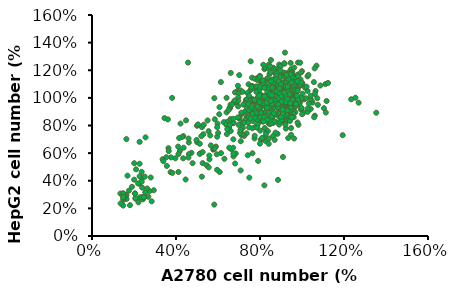
| Category | HepG2 |
|---|---|
| 0.9260116677470136 | 0.904 |
| 0.6408000740809334 | 0.895 |
| 0.8423002129826835 | 0.982 |
| 0.8823039170293546 | 0.94 |
| 0.4341142698398 | 0.563 |
| 0.8156310769515696 | 0.958 |
| 0.8897120103713306 | 0.863 |
| 0.9097138623946661 | 0.835 |
| 0.3452171497360867 | 0.854 |
| 0.9200851930734327 | 0.812 |
| 0.9023057690526901 | 0.991 |
| 0.9097138623946661 | 0.996 |
| 0.8778590610241689 | 0.963 |
| 0.8378553569774979 | 1.005 |
| 0.9037873877210852 | 1.014 |
| 0.9630521344568942 | 0.93 |
| 0.7830354662468747 | 0.921 |
| 0.8326696916381147 | 0.918 |
| 0.8904528197055283 | 0.946 |
| 0.9141587183998519 | 0.923 |
| 0.858598018335031 | 0.955 |
| 0.9334197610889897 | 0.935 |
| 0.9111954810630614 | 0.854 |
| 1.1045467172886378 | 0.925 |
| 0.7645152328919345 | 0.971 |
| 0.8911936290397259 | 1 |
| 0.8904528197055283 | 1.018 |
| 0.9763867024724512 | 1.062 |
| 0.8534123529956478 | 0.979 |
| 0.8897120103713306 | 0.98 |
| 0.9356421890915826 | 0.952 |
| 1.075655153254931 | 0.949 |
| 0.694879155477359 | 1.088 |
| 0.8230391702935457 | 0.953 |
| 0.8734142050189833 | 0.979 |
| 0.8060005556070007 | 0.93 |
| 0.7363644781924252 | 0.743 |
| 0.9682377997962774 | 0.949 |
| 0.8608204463376239 | 0.9 |
| 1.113436429299009 | 0.894 |
| 0.6874710621353829 | 0.966 |
| 0.7341420501898324 | 0.984 |
| 0.8111862209463839 | 0.954 |
| 0.3970738031299194 | 0.563 |
| 0.8430410223168812 | 0.964 |
| 0.9734234651356607 | 0.968 |
| 0.862302065006019 | 0.972 |
| 0.9430502824335587 | 1.044 |
| 0.7978516529308269 | 0.953 |
| 0.6763589221224188 | 0.971 |
| 0.7534030928789702 | 1.055 |
| 0.8274840262987314 | 0.965 |
| 0.8208167422909529 | 0.988 |
| 0.7971108435966293 | 0.934 |
| 0.8637836836744143 | 1.001 |
| 1.0504676358922123 | 0.966 |
| 0.6408000740809334 | 1.001 |
| 0.597833132697472 | 0.814 |
| 0.7400685248634132 | 1.035 |
| 0.7430317622002037 | 0.981 |
| 0.8252615982961385 | 0.961 |
| 0.7741457542365033 | 0.915 |
| 0.8363737383091027 | 0.983 |
| 0.925270858412816 | 0.994 |
| 1.0726919159181405 | 0.997 |
| 0.7897027502546532 | 1.006 |
| 0.7593295675525512 | 0.923 |
| 0.8630428743402166 | 0.892 |
| 0.8482266876562645 | 0.967 |
| 0.8882303917029355 | 0.991 |
| 0.9297157144180017 | 0.839 |
| 1.045281970552829 | 0.98 |
| 0.8534123529956478 | 0.996 |
| 0.8022965089360126 | 1.092 |
| 0.5504213353088249 | 0.837 |
| 0.22668765626446893 | 0.682 |
| 0.771182516899713 | 0.977 |
| 0.831928882303917 | 0.981 |
| 0.8022965089360126 | 1.006 |
| 0.965274562459487 | 1.01 |
| 0.8210005706676812 | 1.208 |
| 0.8735019973368842 | 1.176 |
| 0.8818717899942933 | 1.117 |
| 0.9214380825565912 | 1.049 |
| 0.9267643142476698 | 0.926 |
| 1.0112231310633442 | 0.99 |
| 0.9602434848773065 | 1.003 |
| 0.7601293513410691 | 1.066 |
| 0.9686132775347156 | 1.129 |
| 0.7920867414875404 | 1.044 |
| 0.6574091687274111 | 0.926 |
| 0.9298078752140004 | 1.033 |
| 0.9762221799505422 | 0.952 |
| 0.9678523872931329 | 1.036 |
| 0.948069241011984 | 1.081 |
| 0.9396994483545749 | 1.06 |
| 0.9085029484496862 | 1.08 |
| 0.8400228267072475 | 0.991 |
| 0.8156743389766026 | 1.014 |
| 0.7631729123073997 | 0.992 |
| 0.8210005706676812 | 0.367 |
| 0.5820810348107286 | 0.227 |
| 0.8438272779151608 | 0.978 |
| 0.9085029484496862 | 0.988 |
| 0.9336123264219136 | 1.091 |
| 0.8780673387863801 | 1.004 |
| 0.8674148754042229 | 0.986 |
| 0.9054593874833555 | 0.923 |
| 0.983070192124786 | 0.805 |
| 1.0074186798554308 | 0.894 |
| 0.9442647898040708 | 0.892 |
| 1.2341639718470612 | 0.99 |
| 0.8308921438082557 | 1.022 |
| 0.8620886437131444 | 1.023 |
| 0.9686132775347156 | 1.038 |
| 0.8194787901845159 | 0.874 |
| 0.8118698877686894 | 0.893 |
| 0.8286094730835077 | 0.902 |
| 0.8293703633250904 | 0.956 |
| 0.8293703633250904 | 0.986 |
| 0.9107856191744341 | 0.971 |
| 0.9678523872931329 | 1.008 |
| 0.932851436180331 | 1.01 |
| 0.8696975461289709 | 1.026 |
| 0.9267643142476698 | 0.967 |
| 0.8894806924101198 | 0.884 |
| 0.8575233022636485 | 0.878 |
| 0.8818717899942933 | 0.933 |
| 1.0272018261365798 | 0.899 |
| 0.9244816435229218 | 0.873 |
| 0.8483926193646566 | 1 |
| 0.2548982309301883 | 0.714 |
| 0.8833935704774586 | 0.739 |
| 0.948069241011984 | 0.782 |
| 0.8856762412022066 | 0.406 |
| 0.9396994483545749 | 1.003 |
| 0.8704584363705535 | 0.937 |
| 0.8103481072855241 | 0.957 |
| 0.9130682898991821 | 0.929 |
| 0.9130682898991821 | 0.898 |
| 0.8628495339547271 | 0.724 |
| 0.9343732166634963 | 0.709 |
| 0.9229598630397565 | 0.778 |
| 0.42153319383678906 | 0.814 |
| 0.5006657789613849 | 0.679 |
| 0.8346965950161689 | 1.046 |
| 0.7951303024538711 | 0.927 |
| 0.8963287045843638 | 1.026 |
| 0.49990488871980215 | 0.798 |
| 0.8696975461289709 | 0.88 |
| 0.9686132775347156 | 0.897 |
| 1.0188320334791707 | 0.997 |
| 0.9107856191744341 | 1.02 |
| 0.9404603385961575 | 0.99 |
| 0.9024158265170249 | 1.018 |
| 0.8902415826517025 | 1.051 |
| 0.9275252044892525 | 0.859 |
| 0.9435038995624881 | 0.932 |
| 0.9602434848773065 | 0.925 |
| 0.8955678143427811 | 0.905 |
| 0.6607535194076003 | 1.181 |
| 0.7994141101798357 | 1.159 |
| 0.8280576124989828 | 1.216 |
| 0.7922532346000488 | 1.143 |
| 0.8632110017088453 | 1.219 |
| 0.8749287981121328 | 1.208 |
| 0.8807876963137765 | 1.163 |
| 0.6939539425502482 | 1.052 |
| 0.8104809178940516 | 0.965 |
| 0.9322158027504273 | 1.059 |
| 0.9315648140613557 | 1.114 |
| 0.9048742778094231 | 1.172 |
| 0.9680201806493612 | 1.151 |
| 0.8156888274066239 | 1.24 |
| 0.8697208885995605 | 1.132 |
| 0.8521441939946294 | 1.274 |
| 0.8254536577426967 | 1.123 |
| 0.38147937179591507 | 1 |
| 0.9478395312881439 | 1.208 |
| 0.9165920742127106 | 1.182 |
| 0.8768817641793474 | 1.185 |
| 0.9374237122629995 | 1.142 |
| 0.891203515338921 | 1.241 |
| 0.8892505492717064 | 1.211 |
| 0.8658149564651314 | 1.048 |
| 0.8189437708519814 | 1.114 |
| 0.8664659451542029 | 1.13 |
| 0.8859956058263487 | 1.116 |
| 0.9231019611034258 | 1.133 |
| 0.8977134022296362 | 1.228 |
| 0.8410773862804134 | 1.21 |
| 0.8339165107006266 | 1.14 |
| 0.9439335991537147 | 1.043 |
| 0.7824884042639759 | 1.062 |
| 0.925705915859712 | 1.091 |
| 0.9231019611034258 | 1.043 |
| 0.7069737163316787 | 1.054 |
| 0.9458865652209293 | 1.066 |
| 0.8449833184148425 | 1.172 |
| 0.9120351533892098 | 1.181 |
| 0.8293595898771259 | 0.968 |
| 0.9602083163805029 | 1.092 |
| 0.8202457482301245 | 1.093 |
| 0.9374237122629995 | 1.055 |
| 0.9374237122629995 | 1.065 |
| 0.9615102937586459 | 1.129 |
| 0.9185450402799251 | 1.109 |
| 0.8684189112214176 | 1.132 |
| 0.7831393929530475 | 1.042 |
| 0.9465375539100008 | 1.092 |
| 0.9465375539100008 | 1.093 |
| 0.9204980063471397 | 1.055 |
| 0.9074782325657091 | 1.065 |
| 0.9400276670192855 | 1.129 |
| 0.998616649035723 | 1.109 |
| 0.95044348604443 | 1.132 |
| 0.8007160875579786 | 1.028 |
| 0.8606070469525592 | 1.022 |
| 0.8664659451542029 | 1.086 |
| 0.9491415086662869 | 1.016 |
| 0.9003173569859224 | 1.154 |
| 0.9530474408007161 | 1.015 |
| 0.8957604361624216 | 1.177 |
| 0.9608593050695744 | 1.07 |
| 0.8462852957929856 | 0.952 |
| 0.8514932053055578 | 0.938 |
| 1.0643665066319472 | 1.049 |
| 0.9953617055903654 | 0.92 |
| 0.9940597282122223 | 0.999 |
| 0.9660672145821466 | 1.045 |
| 0.9328667914394987 | 1.033 |
| 0.9328667914394987 | 1.002 |
| 0.9348197575067133 | 0.862 |
| 0.8905525266498494 | 0.903 |
| 0.9725771014728619 | 1.006 |
| 0.9029213117422085 | 0.92 |
| 0.5045162340304338 | 0.808 |
| 0.9296118479941411 | 0.897 |
| 0.9953617055903654 | 0.917 |
| 1.0324680608674424 | 0.958 |
| 0.9274790330537741 | 1.132 |
| 0.9248478868607137 | 1.168 |
| 0.9248478868607137 | 0.966 |
| 0.8097352409143233 | 1.12 |
| 0.8643315244203256 | 1.119 |
| 0.9583950008222332 | 0.987 |
| 0.9248478868607137 | 1.106 |
| 0.9222167406676534 | 1.056 |
| 0.874198322644302 | 0.988 |
| 0.7136984048676205 | 0.885 |
| 0.8663048840651209 | 1.059 |
| 0.8919585594474593 | 1.177 |
| 0.9031409307679658 | 1.066 |
| 0.9537904949843776 | 1.189 |
| 0.9629995066600888 | 1.219 |
| 0.9544482815326426 | 1.153 |
| 0.8123663871073836 | 1.091 |
| 0.7452721591843446 | 1.098 |
| 0.8307844104588061 | 1.118 |
| 0.8695938168064463 | 1.055 |
| 0.9314257523433646 | 0.954 |
| 0.8584114454859398 | 1.03 |
| 0.8649893109685907 | 1.096 |
| 0.8557802992928795 | 1.082 |
| 0.8788028284821575 | 1.095 |
| 0.8663048840651209 | 1.121 |
| 0.9419503371156059 | 1.077 |
| 0.8334155566518665 | 1.107 |
| 0.9524749218878474 | 1.177 |
| 0.8853806939648085 | 1.084 |
| 0.9123499424436771 | 1.06 |
| 0.89722085183358 | 1.199 |
| 0.9044565038644959 | 0.953 |
| 0.9090610097023516 | 0.944 |
| 0.9360302581812202 | 1.036 |
| 0.8018418023351422 | 1.128 |
| 0.8886696267061338 | 1.09 |
| 0.7814504193389246 | 1.083 |
| 0.9189278079263279 | 1.328 |
| 0.9044565038644959 | 1.112 |
| 0.672915638875185 | 0.7 |
| 0.9406347640190759 | 0.964 |
| 0.9156388751850024 | 0.979 |
| 0.732774214767308 | 0.984 |
| 0.8584114454859398 | 1.11 |
| 0.7873704982733103 | 1.143 |
| 0.8814339746752179 | 1.064 |
| 0.9695773721427396 | 1.038 |
| 0.7643479690840322 | 0.981 |
| 0.8965630652853149 | 1.079 |
| 0.9130077289919422 | 0.955 |
| 0.9209011675711232 | 1.031 |
| 0.89722085183358 | 1.099 |
| 0.9814175300115112 | 0.978 |
| 0.9998355533629337 | 1.193 |
| 0.9728663048840651 | 0.965 |
| 0.9097187962506167 | 0.908 |
| 0.8248643315244203 | 0.868 |
| 0.9320835388916296 | 0.953 |
| 0.9182700213780628 | 1.069 |
| 0.7492188784739352 | 0.423 |
| 0.9551060680809077 | 0.97 |
| 0.9820753165597763 | 1.098 |
| 0.6597599079098833 | 0.951 |
| 0.9333991119881598 | 0.938 |
| 0.9399769774708108 | 0.953 |
| 0.9399769774708108 | 0.927 |
| 0.8834073343200132 | 0.957 |
| 0.747903305377405 | 0.983 |
| 0.8807761881269528 | 0.982 |
| 0.9557638546291728 | 1.064 |
| 0.9623417201118237 | 0.997 |
| 0.919585594474593 | 0.949 |
| 0.8952474921887847 | 0.893 |
| 0.9110343693471469 | 0.889 |
| 0.9445814833086663 | 0.914 |
| 0.9248478868607137 | 0.881 |
| 0.9603683604670284 | 0.883 |
| 0.9478704160499918 | 0.932 |
| 0.9893109685906923 | 0.961 |
| 0.954176388240784 | 1.02 |
| 0.9459636024265049 | 1.253 |
| 0.9795613625758283 | 1.169 |
| 0.7600559962669156 | 1.084 |
| 0.7637890807279515 | 1.086 |
| 1.026598226784881 | 1.05 |
| 0.9041530564629024 | 1.086 |
| 0.842183854409706 | 1.241 |
| 0.8511432571161922 | 1.185 |
| 0.8563695753616426 | 1.133 |
| 1.0415305646290247 | 0.919 |
| 1.1117125524965001 | 1.1 |
| 0.8720485300979934 | 1.112 |
| 0.854129724685021 | 1.062 |
| 0.1351376574895007 | 0.307 |
| 0.8832477834811012 | 1.113 |
| 0.9489500699953336 | 1.039 |
| 0.9108726084927672 | 1.033 |
| 0.9250583294447037 | 1.07 |
| 0.8795146990200653 | 1.092 |
| 0.8937004199720019 | 0.892 |
| 0.6592627158189454 | 0.847 |
| 0.8981801213252449 | 1.047 |
| 0.8989267382174522 | 1.091 |
| 1.0691553896406907 | 1.233 |
| 0.19038730751283248 | 0.356 |
| 0.9317778814745684 | 1.12 |
| 0.8929538030797947 | 1.15 |
| 0.9332711152589828 | 1.15 |
| 0.9601493233784414 | 1.092 |
| 0.8623425104993 | 1.084 |
| 0.9168455436304246 | 1.248 |
| 0.7010732617825478 | 1.165 |
| 0.9078861409239384 | 0.991 |
| 0.9571628558096127 | 1.146 |
| 0.8974335044330378 | 1.076 |
| 0.9243117125524964 | 1.104 |
| 0.9116192253849743 | 0.944 |
| 0.9489500699953336 | 1.109 |
| 0.9153523098460102 | 1.25 |
| 0.6809146056929538 | 1.039 |
| 0.8391973868408773 | 0.942 |
| 0.8787680821278582 | 1.177 |
| 0.8160522631824545 | 1.105 |
| 0.9720951936537564 | 1.138 |
| 0.9377508166122258 | 1.005 |
| 0.36136257582827813 | 0.844 |
| 0.9810545963602426 | 1.256 |
| 0.8586094260382641 | 1.082 |
| 0.9041530564629024 | 0.987 |
| 0.9930004666355576 | 1.133 |
| 0.8563695753616426 | 0.977 |
| 1.1236584227718152 | 1.108 |
| 0.9892673821745217 | 1.086 |
| 0.926551563229118 | 1.112 |
| 0.9594027064862343 | 1.055 |
| 0.6988334111059262 | 1.033 |
| 0.745870275314979 | 1.005 |
| 0.7622958469435371 | 1.146 |
| 0.6137190853943071 | 1.115 |
| 0.7988800746616892 | 1.062 |
| 0.8496500233317779 | 1.075 |
| 0.9989734017732151 | 1.099 |
| 0.8130657956136258 | 1.128 |
| 0.8108259449370042 | 0.836 |
| 0.8571161922538497 | 1.037 |
| 0.8772748483434438 | 1.161 |
| 0.8698086794213719 | 1.111 |
| 0.9362575828278115 | 1.136 |
| 0.9982267848810079 | 0.984 |
| 1.0601959869342044 | 1.214 |
| 0.7667755482967802 | 0.987 |
| 0.8406906206252917 | 0.977 |
| 0.8511432571161922 | 0.991 |
| 0.7921605226318246 | 0.975 |
| 0.822025198320112 | 1.01 |
| 0.8526364909006067 | 1.12 |
| 0.9706019598693421 | 1.013 |
| 1.0878208119458703 | 1.09 |
| 0.9788147456836211 | 0.822 |
| 0.3765527950310559 | 0.569 |
| 0.20419254658385094 | 0.308 |
| 0.18090062111801242 | 0.223 |
| 0.8400621118012422 | 1.073 |
| 0.7368012422360248 | 0.985 |
| 0.8586956521739131 | 1.073 |
| 0.7523291925465838 | 0.972 |
| 0.9790372670807453 | 1.061 |
| 0.35403726708074534 | 0.57 |
| 0.2422360248447205 | 0.266 |
| 0.43478260869565216 | 0.723 |
| 0.6071428571428571 | 0.933 |
| 0.8881987577639752 | 1.117 |
| 0.8936335403726708 | 0.979 |
| 0.9914596273291926 | 1.255 |
| 0.7756211180124224 | 1.138 |
| 0.20729813664596272 | 0.27 |
| 0.3641304347826087 | 0.636 |
| 0.6964285714285714 | 1.003 |
| 0.7523291925465838 | 0.98 |
| 0.7888198757763976 | 1.127 |
| 0.781832298136646 | 0.948 |
| 0.7468944099378882 | 0.969 |
| 0.7476708074534162 | 1.015 |
| 0.8222049689440993 | 1.077 |
| 0.7282608695652174 | 0.9 |
| 0.47360248447204967 | 0.603 |
| 0.2267080745341615 | 0.279 |
| 0.6964285714285714 | 0.979 |
| 0.5846273291925466 | 0.845 |
| 0.20729813664596272 | 0.274 |
| 0.6420807453416149 | 0.826 |
| 0.7243788819875776 | 0.724 |
| 0.9736024844720497 | 0.972 |
| 0.2841614906832298 | 0.251 |
| 0.8346273291925466 | 0.985 |
| 0.42934782608695654 | 0.718 |
| 0.84472049689441 | 1.02 |
| 0.5768633540372671 | 0.626 |
| 0.45729813664596275 | 1.256 |
| 0.2942546583850932 | 0.331 |
| 0.7919254658385093 | 0.983 |
| 0.8043478260869565 | 0.959 |
| 0.5551242236024845 | 0.759 |
| 0.922360248447205 | 1.082 |
| 0.7927018633540373 | 1.142 |
| 0.8020186335403726 | 1.081 |
| 0.9456521739130435 | 1.057 |
| 0.562888198757764 | 0.728 |
| 0.8517080745341615 | 0.892 |
| 0.6956521739130435 | 0.938 |
| 0.2468944099378882 | 0.277 |
| 0.53027950310559 | 0.737 |
| 0.7360248447204969 | 0.861 |
| 0.7274844720496895 | 0.959 |
| 0.8711180124223602 | 1.021 |
| 0.8812111801242236 | 0.954 |
| 0.8874223602484472 | 1.109 |
| 0.7600931677018633 | 1.079 |
| 0.8889751552795031 | 0.994 |
| 0.23680124223602483 | 0.282 |
| 0.25077639751552794 | 0.286 |
| 0.23835403726708074 | 0.419 |
| 0.7958074534161491 | 1.017 |
| 0.9425465838509317 | 1.02 |
| 0.8781055900621118 | 0.951 |
| 1.0015527950310559 | 1.106 |
| 0.9021739130434783 | 0.913 |
| 0.7857142857142857 | 0.949 |
| 0.4611801242236025 | 0.677 |
| 0.7383540372670807 | 0.927 |
| 1.0566770186335404 | 1.114 |
| 0.22127329192546583 | 0.244 |
| 0.44798136645962733 | 0.837 |
| 0.702639751552795 | 0.847 |
| 0.7204968944099379 | 0.951 |
| 0.6793478260869565 | 0.981 |
| 0.6545031055900621 | 0.927 |
| 0.717391304347826 | 1.044 |
| 0.9953416149068323 | 1.183 |
| 0.7124448367166814 | 0.729 |
| 0.8444836716681376 | 0.831 |
| 0.8889673433362754 | 0.924 |
| 0.20970873786407768 | 0.483 |
| 1.002647837599294 | 1.03 |
| 0.8691968225948808 | 0.975 |
| 0.8218887908208297 | 0.949 |
| 1.0259488084730803 | 0.922 |
| 0.7915269196822595 | 0.89 |
| 0.43636363636363634 | 0.639 |
| 0.8614298323036187 | 0.831 |
| 1.0407766990291263 | 0.994 |
| 0.7781112091791703 | 0.79 |
| 0.8910856134157105 | 0.806 |
| 0.37422771403353927 | 0.462 |
| 1.0005295675198589 | 0.882 |
| 0.8190644307149162 | 0.867 |
| 0.5959399823477494 | 0.719 |
| 0.8903795233892321 | 0.973 |
| 0.8903795233892321 | 0.933 |
| 0.5825242718446602 | 0.998 |
| 0.2796116504854369 | 0.424 |
| 0.9807590467784643 | 1.157 |
| 1.1170344218887909 | 0.977 |
| 0.7025595763459841 | 0.859 |
| 0.8854368932038835 | 1.004 |
| 0.8522506619593998 | 1.028 |
| 0.7985878199470432 | 0.884 |
| 0.953927625772286 | 0.994 |
| 0.9659311562224183 | 1.114 |
| 0.8776699029126214 | 1.134 |
| 0.35657546337157986 | 0.507 |
| 0.7555163283318623 | 1.264 |
| 0.8473080317740512 | 1.228 |
| 0.9433362753751103 | 1.104 |
| 0.8289496910856134 | 0.896 |
| 0.9977052074139453 | 0.998 |
| 0.9299205648720212 | 0.906 |
| 0.9221535745807591 | 1.006 |
| 0.9285083848190644 | 0.876 |
| 0.7180935569285084 | 0.819 |
| 0.8042365401588703 | 0.833 |
| 0.7865842894969108 | 0.843 |
| 0.8529567519858782 | 0.914 |
| 0.9355692850838482 | 1.185 |
| 0.9920564872021183 | 1.093 |
| 1.0132391879964695 | 1.075 |
| 0.9659311562224183 | 0.943 |
| 0.5902912621359223 | 0.647 |
| 0.2266548984995587 | 0.432 |
| 0.8473080317740512 | 0.928 |
| 0.25136804942630186 | 0.43 |
| 0.7449249779346867 | 0.861 |
| 1.0217122683142101 | 1.081 |
| 0.9786407766990292 | 1.12 |
| 1.26954986760812 | 0.965 |
| 0.860017652250662 | 0.863 |
| 0.6524271844660194 | 0.784 |
| 0.7442188879082083 | 0.955 |
| 0.5959399823477494 | 0.788 |
| 0.9094439541041482 | 0.572 |
| 0.6058252427184466 | 0.882 |
| 0.8875551632833186 | 1.089 |
| 1.0612533097969992 | 1.028 |
| 0.7300970873786408 | 0.839 |
| 0.5133274492497794 | 0.668 |
| 0.2266548984995587 | 0.523 |
| 0.9045013239187997 | 1.036 |
| 0.336098852603707 | 0.556 |
| 0.23654015887025595 | 0.464 |
| 0.41800529567519856 | 0.615 |
| 0.8812003530450132 | 1.008 |
| 0.7639894086496029 | 0.78 |
| 0.942630185348632 | 0.833 |
| 0.8007060900264784 | 0.867 |
| 0.893909973521624 | 0.827 |
| 0.8621359223300971 | 0.819 |
| 0.8409532215357458 | 0.833 |
| 0.7894086496028243 | 0.808 |
| 0.7738746690203001 | 0.707 |
| 0.6080741742321808 | 0.463 |
| 0.9627197218466294 | 0.706 |
| 0.7417423218079969 | 0.585 |
| 0.79119180992853 | 0.543 |
| 0.6629322001158973 | 0.629 |
| 0.7865559204172301 | 0.784 |
| 0.873092524628163 | 0.828 |
| 0.8978172686884296 | 0.922 |
| 0.559397334363531 | 0.555 |
| 0.22406799304616573 | 0.379 |
| 0.7077457987251304 | 0.475 |
| 0.9604017770909793 | 0.86 |
| 0.16457407765114931 | 0.268 |
| 0.21943210353486575 | 0.381 |
| 0.238748309831949 | 0.351 |
| 0.2742901294185822 | 0.325 |
| 0.41182151825381497 | 0.463 |
| 0.6722039791384972 | 0.817 |
| 0.7154722812439637 | 0.739 |
| 0.8128259609812633 | 0.828 |
| 0.9124975854742129 | 0.96 |
| 1.041529843538729 | 1.015 |
| 0.26810894340351554 | 0.284 |
| 1.193741549159745 | 0.73 |
| 0.16380142939926598 | 0.297 |
| 0.8251883330113966 | 0.689 |
| 0.24724744060266562 | 0.282 |
| 0.5269461077844312 | 0.528 |
| 0.8738651728800464 | 0.749 |
| 0.15684759513231603 | 0.289 |
| 0.6737492756422638 | 0.576 |
| 1.0608460498358123 | 0.871 |
| 0.6946107784431138 | 0.858 |
| 0.8043268302105466 | 0.89 |
| 0.6606142553602472 | 0.76 |
| 0.8298242225226965 | 0.756 |
| 0.14989376086536604 | 0.261 |
| 0.6273903805292641 | 0.824 |
| 0.7641491211126135 | 0.599 |
| 1.3536797372995943 | 0.893 |
| 0.5153563840061812 | 0.597 |
| 0.5462623140815144 | 0.512 |
| 0.6142553602472475 | 0.6 |
| 0.14834846436159937 | 0.272 |
| 0.3654626231408151 | 0.615 |
| 0.6397527525593973 | 0.804 |
| 0.8390960015452965 | 0.82 |
| 0.8414139463009465 | 0.667 |
| 0.20088854548966584 | 0.408 |
| 0.2534286266177323 | 0.317 |
| 0.5941665056982809 | 0.592 |
| 0.7525593973343635 | 0.903 |
| 0.8390960015452965 | 0.952 |
| 0.8460498358122465 | 0.81 |
| 0.948039405060846 | 0.733 |
| 0.8035541819586633 | 0.697 |
| 0.4102762217500483 | 0.647 |
| 0.8313695190264632 | 0.87 |
| 0.9418582190457794 | 0.864 |
| 0.5957118022020476 | 0.479 |
| 1.057755456828279 | 0.86 |
| 0.971218852617346 | 0.941 |
| 0.9488120533127293 | 0.863 |
| 0.6304809735367973 | 0.559 |
| 0.7873285686691134 | 0.937 |
| 0.8197797952482132 | 0.713 |
| 0.718562874251497 | 0.783 |
| 0.8700019316206297 | 0.696 |
| 0.5130384392505312 | 0.595 |
| 0.5655785203785977 | 0.656 |
| 0.5269461077844312 | 0.607 |
| 0.6722039791384972 | 0.639 |
| 0.8584122078423797 | 0.988 |
| 0.9209967162449295 | 0.806 |
| 0.16380142939926598 | 0.701 |
| 0.9974888931813792 | 0.927 |
| 0.8545489665829631 | 0.851 |
| 0.44581804133668146 | 0.409 |
| 0.1514390573691327 | 0.305 |
| 0.7996909406992466 | 0.669 |
| 0.8152694862524174 | 0.961 |
| 0.8011435298074497 | 0.859 |
| 0.708315816026234 | 0.686 |
| 0.8650466661061128 | 0.829 |
| 0.6740099218027411 | 0.821 |
| 0.5556209535020601 | 0.497 |
| 0.8583200201799378 | 0.971 |
| 0.8152694862524174 | 0.842 |
| 0.41167073068191373 | 0.593 |
| 0.6524846548389809 | 0.78 |
| 0.7823089212141596 | 0.892 |
| 0.9161691751450433 | 0.955 |
| 0.7453123686201968 | 0.895 |
| 0.9504750693685361 | 1.112 |
| 0.9350037837383335 | 1.172 |
| 0.7480030269906668 | 0.91 |
| 0.8206508029933575 | 1.073 |
| 0.8993525603296056 | 1.085 |
| 0.14798621037585133 | 0.309 |
| 0.8704279828470529 | 1.045 |
| 0.2011267131926343 | 0.527 |
| 0.9477844109980661 | 1.177 |
| 0.9444210880349786 | 1.169 |
| 1.254519465231649 | 1.001 |
| 0.7251324308416716 | 0.82 |
| 0.711006474396704 | 0.893 |
| 0.667283275876566 | 0.953 |
| 0.7991255360295972 | 1.153 |
| 0.887917262255108 | 1.12 |
| 0.886571933069873 | 1.055 |
| 0.14865887496846886 | 0.282 |
| 0.17623812326578658 | 0.329 |
| 0.4614479105356092 | 0.593 |
| 0.6847725552846212 | 0.597 |
| 0.774909610695367 | 0.985 |
| 0.656520642394686 | 0.805 |
| 0.8596653493651728 | 1.03 |
| 0.8993525603296056 | 1.097 |
| 0.8522660388463802 | 0.815 |
| 0.996888926259144 | 1.111 |
| 0.5583116118725301 | 0.582 |
| 0.23677793660136215 | 0.393 |
| 0.82266879677121 | 0.782 |
| 0.8374674178087951 | 0.759 |
| 0.7594383250651644 | 0.931 |
| 0.9323131253678635 | 0.98 |
| 0.8939712435886656 | 0.962 |
| 1.0264861683343143 | 1.156 |
| 0.9087698646262508 | 0.872 |
| 0.8287227781047675 | 0.74 |
| 0.9827629698141764 | 0.97 |
| 0.9646010258135037 | 0.982 |
| 0.6006894812074329 | 0.746 |
| 0.8711006474396704 | 1.015 |
| 0.9450937526275961 | 1.067 |
| 0.9793996468510888 | 1.051 |
| 0.8805179517363155 | 1.013 |
| 0.9403851004792735 | 1.043 |
| 0.6504666610611284 | 0.911 |
| 0.9255864794416884 | 1.166 |
| 0.8791726225510804 | 1.048 |
| 0.935676448330951 | 1.072 |
| 0.9457664172202136 | 1.049 |
| 0.9538383923316236 | 0.986 |
| 0.773564281510132 | 0.86 |
| 0.8462120575128227 | 1.028 |
| 0.8939712435886656 | 1.03 |
| 0.9074245354410158 | 0.95 |
| 0.9006978895148406 | 0.974 |
| 0.8778272933658454 | 0.958 |
| 0.9417304296645085 | 1.037 |
| 1.0305221558900193 | 1.166 |
| 0.8193054738081225 | 0.862 |
| 0.7984528714369797 | 0.97 |
| 0.6982258471369713 | 0.805 |
| 0.8926259144034306 | 1.069 |
| 0.932985789960481 | 1.019 |
| 0.8650466661061128 | 0.931 |
| 0.9336584545530985 | 1.045 |
| 0.939712435886656 | 1.025 |
| 0.16898345888017396 | 0.437 |
| 0.951774481633921 | 0.858 |
| 0.921953871243302 | 0.995 |
| 0.8554787605808807 | 0.912 |
| 0.8585850741632368 | 0.907 |
| 0.7672594548419663 | 0.831 |
| 0.8598275995961793 | 0.878 |
| 0.7436514716160596 | 0.821 |
| 0.5231032072687738 | 0.43 |
| 0.26279412906732935 | 0.344 |
| 0.9033159897491652 | 0.843 |
| 0.45973441018870853 | 0.706 |
| 0.8995884134503378 | 0.937 |
| 0.9008309388832803 | 0.862 |
| 0.14848178923662345 | 0.22 |
| 0.13605653490719888 | 0.236 |
| 0.6535683777277316 | 0.639 |
| 0.673448784654811 | 0.596 |
| 0.7480003106313582 | 0.787 |
| 0.6728275219383397 | 0.849 |
| 0.7641531412596102 | 0.883 |
| 0.8095053195620098 | 0.709 |
| 0.9089073541974062 | 0.89 |
| 0.9331366001397841 | 0.981 |
| 0.8741166420750175 | 0.982 |
| 0.580880639900598 | 0.63 |
| 0.7765783955890347 | 0.856 |
| 0.8424322435349848 | 0.706 |
| 0.8014289042478838 | 0.763 |
| 0.523724469985245 | 0.788 |
| 0.6423856488312495 | 0.738 |
| 0.9058010406150501 | 0.962 |
| 0.6815251999689369 | 0.525 |
| 0.6442494369806632 | 0.774 |
| 0.5846082161994254 | 0.636 |
| 0.4789935543993166 | 0.527 |
| 0.7554554632290129 | 0.851 |
| 0.9151199813621185 | 0.996 |
| 0.8908907354197406 | 0.969 |
| 0.9797313038751262 | 0.991 |
| 0.41500349460278013 | 0.709 |
| 0.49763143589345343 | 0.695 |
| 0.8312495146385027 | 0.965 |
| 0.9070435660479925 | 0.972 |
| 0.8585850741632368 | 0.903 |
| 0.8877844218373845 | 1 |
| 0.8691465403432477 | 0.957 |
| 0.8859206336879708 | 0.933 |
| 0.5206181564028889 | 0.722 |
| 0.9026947270326939 | 1.013 |
| 0.9207113458103595 | 1.021 |
| 0.8418109808185136 | 0.897 |
| 0.8548574978644095 | 0.865 |
| 0.9157412440785897 | 1.038 |
| 0.4591131474722373 | 0.568 |
| 0.9026947270326939 | 0.974 |
| 0.8573425487302944 | 0.954 |
| 0.5324221480158422 | 0.806 |
| 0.8859206336879708 | 0.953 |
| 0.8567212860138231 | 1.019 |
| 0.8436747689679273 | 0.926 |
| 0.8337345655043876 | 0.927 |
| 0.7051331831948435 | 0.746 |
| 0.9318940747068416 | 1.081 |
| 0.8654189640444203 | 0.889 |
| 0.9238176593927157 | 0.969 |
| 0.9076648287644637 | 0.915 |
| 0.8517511842820533 | 0.978 |
| 0.7069969713442572 | 0.768 |
| 0.845538557117341 | 0.835 |
| 0.8337345655043876 | 0.844 |
| 0.20501669643550516 | 0.307 |
| 0.9312728119903704 | 0.993 |
| 0.7747146074396211 | 0.726 |
| 0.8163392094431933 | 0.83 |
| 0.38269783334627633 | 0.457 |
| 0.9443193290362663 | 0.962 |
| 0.971033625844529 | 0.956 |
| 0.3398307059097616 | 0.542 |
| 0.9760037275762988 | 1.016 |